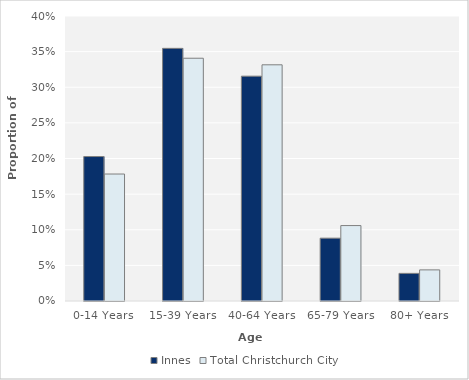
| Category | Innes | Total Christchurch City |
|---|---|---|
| 0-14 Years | 0.203 | 0.178 |
| 15-39 Years | 0.355 | 0.341 |
| 40-64 Years | 0.316 | 0.331 |
| 65-79 Years | 0.088 | 0.106 |
| 80+ Years | 0.039 | 0.044 |